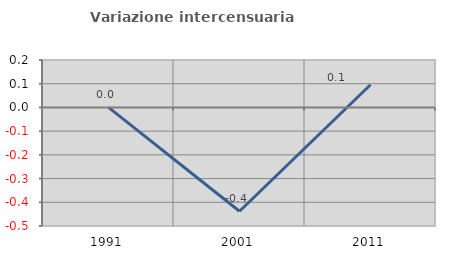
| Category | Variazione intercensuaria annua |
|---|---|
| 1991.0 | 0 |
| 2001.0 | -0.438 |
| 2011.0 | 0.096 |